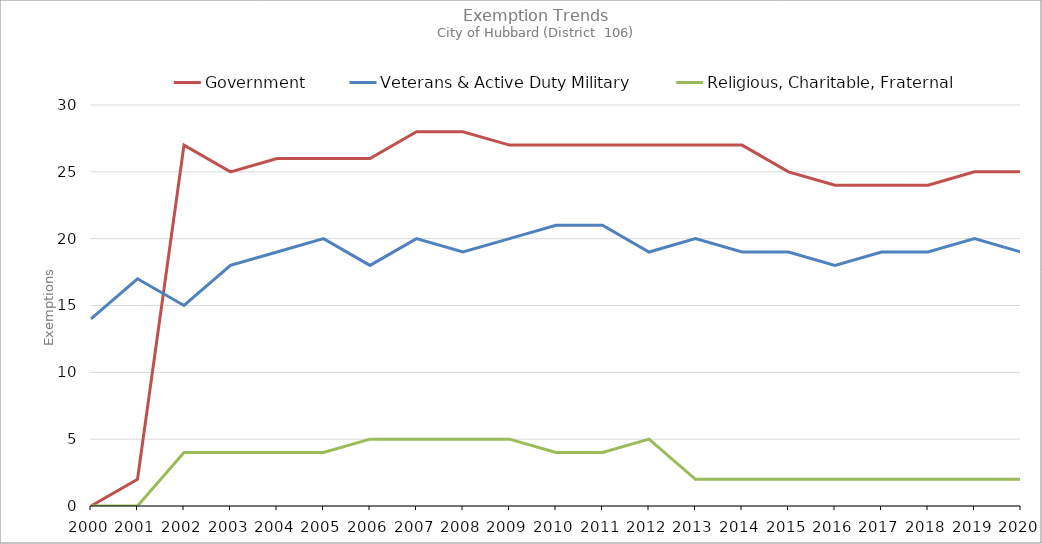
| Category | Government | Veterans & Active Duty Military | Religious, Charitable, Fraternal |
|---|---|---|---|
| 2000.0 | 0 | 14 | 0 |
| 2001.0 | 2 | 17 | 0 |
| 2002.0 | 27 | 15 | 4 |
| 2003.0 | 25 | 18 | 4 |
| 2004.0 | 26 | 19 | 4 |
| 2005.0 | 26 | 20 | 4 |
| 2006.0 | 26 | 18 | 5 |
| 2007.0 | 28 | 20 | 5 |
| 2008.0 | 28 | 19 | 5 |
| 2009.0 | 27 | 20 | 5 |
| 2010.0 | 27 | 21 | 4 |
| 2011.0 | 27 | 21 | 4 |
| 2012.0 | 27 | 19 | 5 |
| 2013.0 | 27 | 20 | 2 |
| 2014.0 | 27 | 19 | 2 |
| 2015.0 | 25 | 19 | 2 |
| 2016.0 | 24 | 18 | 2 |
| 2017.0 | 24 | 19 | 2 |
| 2018.0 | 24 | 19 | 2 |
| 2019.0 | 25 | 20 | 2 |
| 2020.0 | 25 | 19 | 2 |